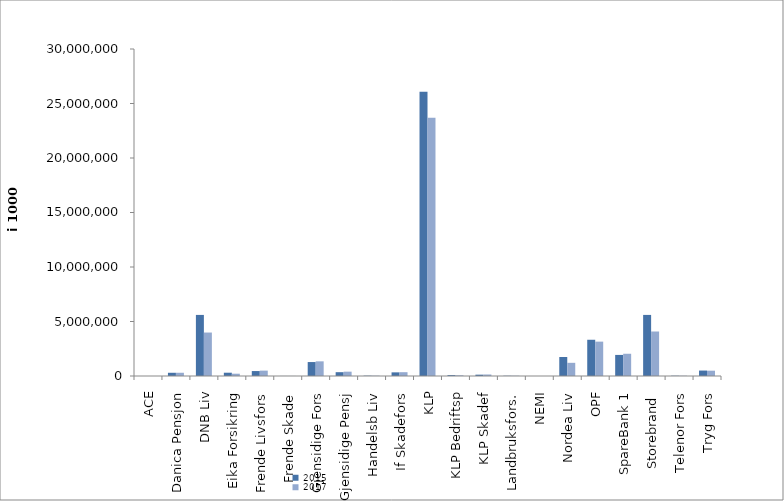
| Category | 2015 | 2017 |
|---|---|---|
| ACE | 0 | 0 |
| Danica Pensjon | 295963.266 | 296945.323 |
| DNB Liv | 5603733 | 3987303.293 |
| Eika Forsikring | 302208 | 210802 |
| Frende Livsfors | 454023 | 492991.8 |
| Frende Skade | 4460 | 5631 |
| Gjensidige Fors | 1280022 | 1345481 |
| Gjensidige Pensj | 349737.366 | 397649.359 |
| Handelsb Liv | 29736 | 28772 |
| If Skadefors | 334860.866 | 349378.466 |
| KLP | 26078051.088 | 23695892.482 |
| KLP Bedriftsp | 82464 | 61324 |
| KLP Skadef | 122502 | 138577.387 |
| Landbruksfors. | 22948 | 24813 |
| NEMI | 1465 | 2011 |
| Nordea Liv | 1741415.588 | 1209085.466 |
| OPF | 3324961 | 3152879 |
| SpareBank 1 | 1933661.032 | 2040328.448 |
| Storebrand  | 5604066.092 | 4082640.238 |
| Telenor Fors | 25828 | 23751 |
| Tryg Fors | 499374.443 | 487718.421 |